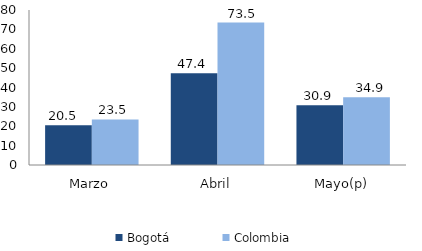
| Category | Bogotá | Colombia |
|---|---|---|
| Marzo | 20.519 | 23.516 |
| Abril | 47.352 | 73.495 |
| Mayo(p) | 30.857 | 34.911 |